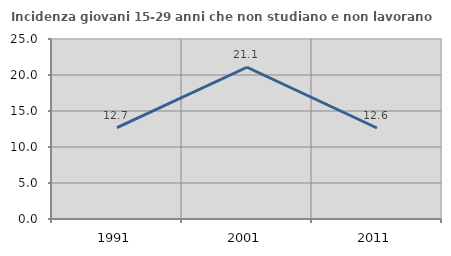
| Category | Incidenza giovani 15-29 anni che non studiano e non lavorano  |
|---|---|
| 1991.0 | 12.698 |
| 2001.0 | 21.076 |
| 2011.0 | 12.637 |